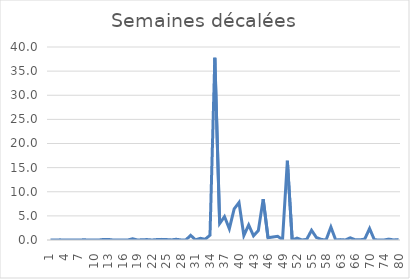
| Category | Semaines décalées |
|---|---|
| 1.0 | 0 |
| 2.0 | 0 |
| 3.0 | 0.03 |
| 4.0 | 0 |
| 5.0 | 0.01 |
| 6.0 | 0.02 |
| 7.0 | 0.01 |
| 8.0 | 0.04 |
| 9.0 | 0 |
| 10.0 | 0 |
| 11.0 | 0 |
| 12.0 | 0.12 |
| 13.0 | 0.12 |
| 14.0 | 0 |
| 15.0 | 0.01 |
| 16.0 | 0 |
| 17.0 | 0 |
| 18.0 | 0.26 |
| 19.0 | 0 |
| 20.0 | 0.05 |
| 21.0 | 0.09 |
| 22.0 | 0 |
| 23.0 | 0.09 |
| 24.0 | 0.13 |
| 25.0 | 0.09 |
| 26.0 | 0.02 |
| 27.0 | 0.15 |
| 28.0 | 0.02 |
| 29.0 | 0 |
| 30.0 | 0.97 |
| 31.0 | 0.02 |
| 32.0 | 0.35 |
| 33.0 | 0.15 |
| 34.0 | 1 |
| 35.0 | 37.77 |
| 36.0 | 3.42 |
| 37.0 | 4.86 |
| 38.0 | 2.34 |
| 39.0 | 6.44 |
| 40.0 | 7.76 |
| 41.0 | 0.92 |
| 42.0 | 3.12 |
| 43.0 | 0.87 |
| 44.0 | 1.95 |
| 45.0 | 8.47 |
| 46.0 | 0.46 |
| 47.0 | 0.62 |
| 48.0 | 0.75 |
| 49.0 | 0.07 |
| 50.0 | 16.43 |
| 51.0 | 0 |
| 52.0 | 0.39 |
| 53.0 | 0.01 |
| 54.0 | 0.13 |
| 55.0 | 2.01 |
| 56.0 | 0.52 |
| 57.0 | 0.12 |
| 58.0 | 0 |
| 60.0 | 2.68 |
| 62.0 | 0 |
| 63.0 | 0.08 |
| 64.0 | 0.01 |
| 65.0 | 0.46 |
| 66.0 | 0.05 |
| 67.0 | 0.03 |
| 68.0 | 0.19 |
| 70.0 | 2.38 |
| 71.0 | 0.03 |
| 72.0 | 0.02 |
| 74.0 | 0.01 |
| 75.0 | 0.18 |
| 78.0 | 0.01 |
| 80.0 | 0.09 |